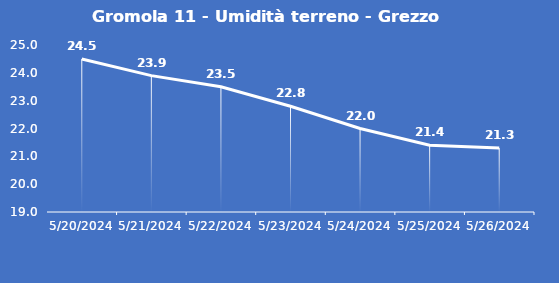
| Category | Gromola 11 - Umidità terreno - Grezzo (%VWC) |
|---|---|
| 5/20/24 | 24.5 |
| 5/21/24 | 23.9 |
| 5/22/24 | 23.5 |
| 5/23/24 | 22.8 |
| 5/24/24 | 22 |
| 5/25/24 | 21.4 |
| 5/26/24 | 21.3 |